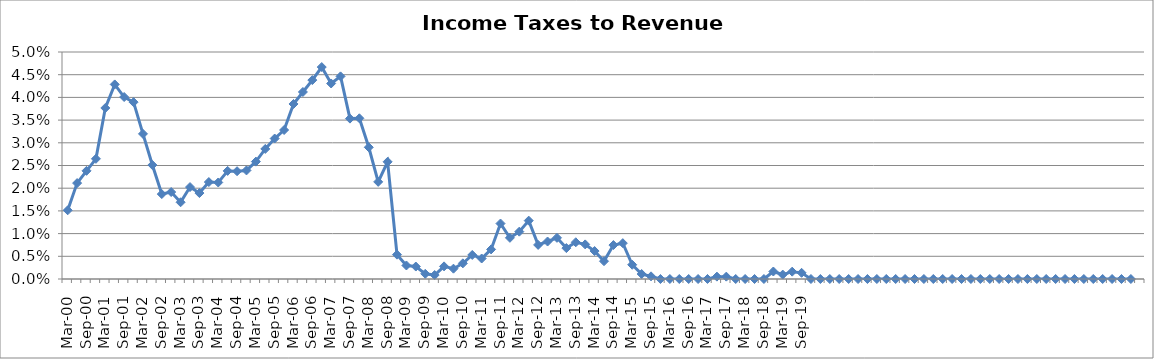
| Category | Income Taxes to Revenue (%) |
|---|---|
| Mar-00 | 0.015 |
| Jun-00 | 0.021 |
| Sep-00 | 0.024 |
| Dec-00 | 0.026 |
| Mar-01 | 0.038 |
| Jun-01 | 0.043 |
| Sep-01 | 0.04 |
| Dec-01 | 0.039 |
| Mar-02 | 0.032 |
| Jun-02 | 0.025 |
| Sep-02 | 0.019 |
| Dec-02 | 0.019 |
| Mar-03 | 0.017 |
| Jun-03 | 0.02 |
| Sep-03 | 0.019 |
| Dec-03 | 0.021 |
| Mar-04 | 0.021 |
| Jun-04 | 0.024 |
| Sep-04 | 0.024 |
| Dec-04 | 0.024 |
| Mar-05 | 0.026 |
| Jun-05 | 0.029 |
| Sep-05 | 0.031 |
| Dec-05 | 0.033 |
| Mar-06 | 0.039 |
| Jun-06 | 0.041 |
| Sep-06 | 0.044 |
| Dec-06 | 0.047 |
| Mar-07 | 0.043 |
| Jun-07 | 0.045 |
| Sep-07 | 0.035 |
| Dec-07 | 0.035 |
| Mar-08 | 0.029 |
| Jun-08 | 0.021 |
| Sep-08 | 0.026 |
| Dec-08 | 0.005 |
| Mar-09 | 0.003 |
| Jun-09 | 0.003 |
| Sep-09 | 0.001 |
| Dec-09 | 0.001 |
| Mar-10 | 0.003 |
| Jun-10 | 0.002 |
| Sep-10 | 0.003 |
| Dec-10 | 0.005 |
| Mar-11 | 0.005 |
| Jun-11 | 0.007 |
| Sep-11 | 0.012 |
| Dec-11 | 0.009 |
| Mar-12 | 0.01 |
| Jun-12 | 0.013 |
| Sep-12 | 0.008 |
| Dec-12 | 0.008 |
| Mar-13 | 0.009 |
| Jun-13 | 0.007 |
| Sep-13 | 0.008 |
| Dec-13 | 0.008 |
| Mar-14 | 0.006 |
| Jun-14 | 0.004 |
| Sep-14 | 0.007 |
| Dec-14 | 0.008 |
| Mar-15 | 0.003 |
| Jun-15 | 0.001 |
| Sep-15 | 0.001 |
| Dec-15 | 0 |
| Mar-16 | 0 |
| Jun-16 | 0 |
| Sep-16 | 0 |
| Dec-16 | 0 |
| Mar-17 | 0 |
| Jun-17 | 0.001 |
| Sep-17 | 0.001 |
| Dec-17 | 0 |
| Mar-18 | 0 |
| Jun-18 | 0 |
| Sep-18 | 0 |
| Dec-18 | 0.002 |
| Mar-19 | 0.001 |
| Jun-19 | 0.002 |
| Sep-19 | 0.001 |